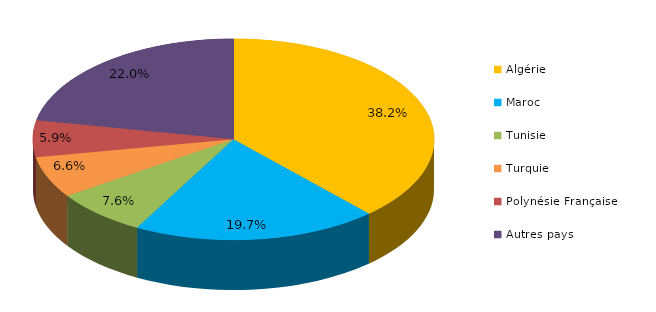
| Category | Series 0 |
|---|---|
| Algérie | 200576 |
| Maroc | 103582 |
| Tunisie | 39629 |
| Turquie | 34815 |
| Polynésie Française | 30977 |
| Autres pays | 115222 |